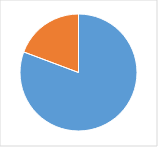
| Category | Series 0 |
|---|---|
| 0 | 0.807 |
| 1 | 0.193 |
| 2 | 0 |